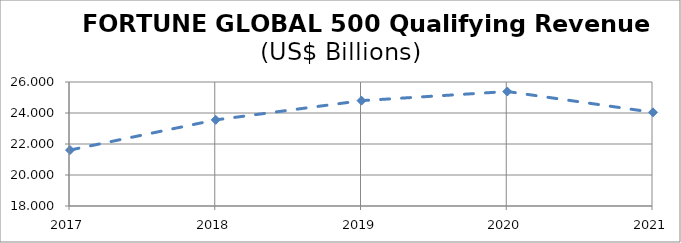
| Category | FORTUNE GLOBAL 500 QUALIFYING REVENUES |
|---|---|
| 2017.0 | 21.609 |
| 2018.0 | 23.556 |
| 2019.0 | 24.796 |
| 2020.0 | 25.386 |
| 2021.0 | 24.043 |